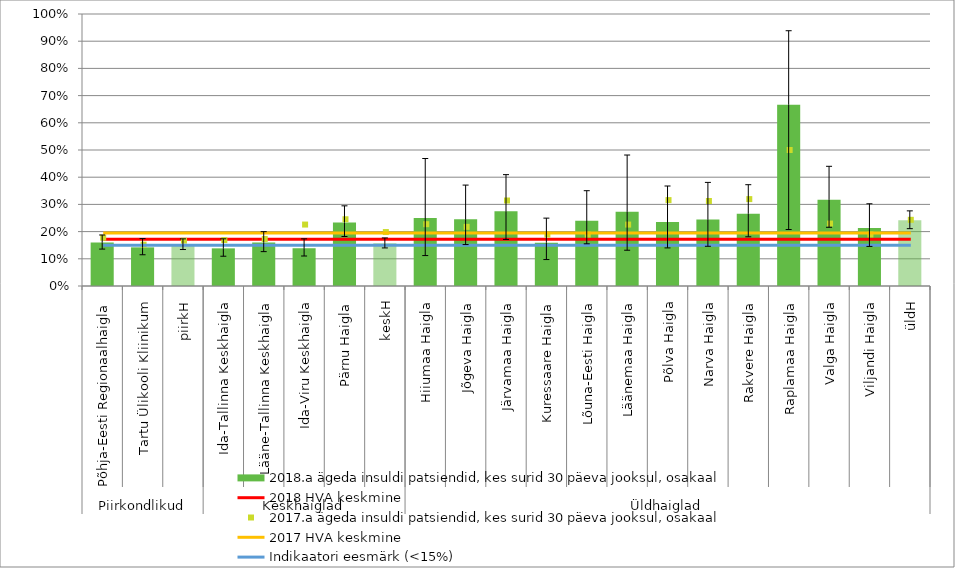
| Category | 2018.a ägeda insuldi patsiendid, kes surid 30 päeva jooksul, osakaal |
|---|---|
| 0 | 0.16 |
| 1 | 0.142 |
| 2 | 0.153 |
| 3 | 0.138 |
| 4 | 0.16 |
| 5 | 0.139 |
| 6 | 0.234 |
| 7 | 0.157 |
| 8 | 0.25 |
| 9 | 0.246 |
| 10 | 0.275 |
| 11 | 0.159 |
| 12 | 0.239 |
| 13 | 0.273 |
| 14 | 0.235 |
| 15 | 0.245 |
| 16 | 0.266 |
| 17 | 0.667 |
| 18 | 0.317 |
| 19 | 0.214 |
| 20 | 0.242 |